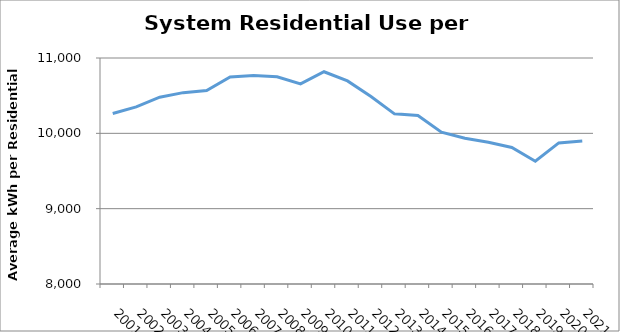
| Category | Residential |
|---|---|
| 2001.0 | 10264.075 |
| 2002.0 | 10351.616 |
| 2003.0 | 10480.004 |
| 2004.0 | 10540.102 |
| 2005.0 | 10567.053 |
| 2006.0 | 10748.61 |
| 2007.0 | 10768.913 |
| 2008.0 | 10750.197 |
| 2009.0 | 10655.837 |
| 2010.0 | 10817.765 |
| 2011.0 | 10696.189 |
| 2012.0 | 10489.614 |
| 2013.0 | 10258.719 |
| 2014.0 | 10237.847 |
| 2015.0 | 10015.588 |
| 2016.0 | 9935.687 |
| 2017.0 | 9882.22 |
| 2018.0 | 9812.322 |
| 2019.0 | 9628.817 |
| 2020.0 | 9873.227 |
| 2021.0 | 9899.348 |